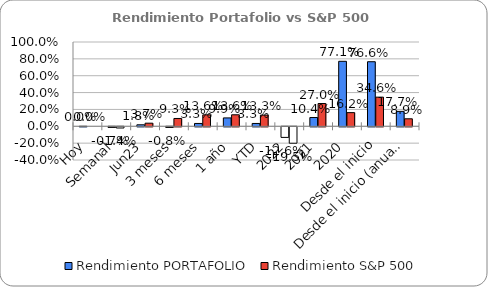
| Category | Rendimiento PORTAFOLIO | Rendimiento S&P 500 |
|---|---|---|
| Hoy | 0 | 0 |
| Semanal | -0.007 | -0.014 |
| Jun23 | 0.018 | 0.037 |
| 3 meses | -0.008 | 0.093 |
| 6 meses | 0.033 | 0.136 |
| 1 año | 0.099 | 0.136 |
| YTD | 0.033 | 0.133 |
| 2022 | -0.126 | -0.195 |
| 2021 | 0.104 | 0.27 |
| 2020 | 0.771 | 0.162 |
| Desde el inicio | 0.766 | 0.346 |
| Desde el inicio (anual) | 0.177 | 0.089 |